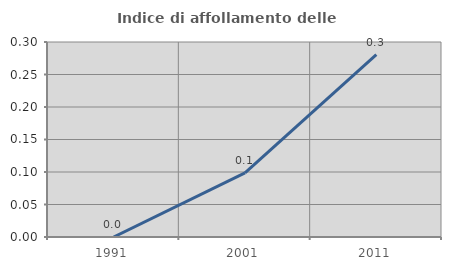
| Category | Indice di affollamento delle abitazioni  |
|---|---|
| 1991.0 | 0 |
| 2001.0 | 0.099 |
| 2011.0 | 0.281 |